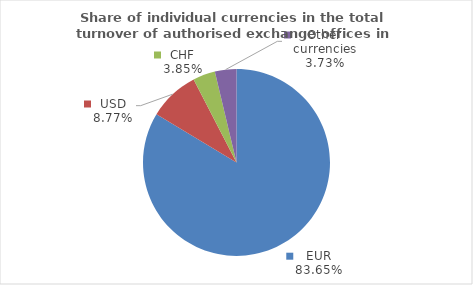
| Category | Series 0 |
|---|---|
| EUR | 83.653 |
| USD | 8.768 |
| CHF | 3.852 |
| Other currencies | 3.728 |